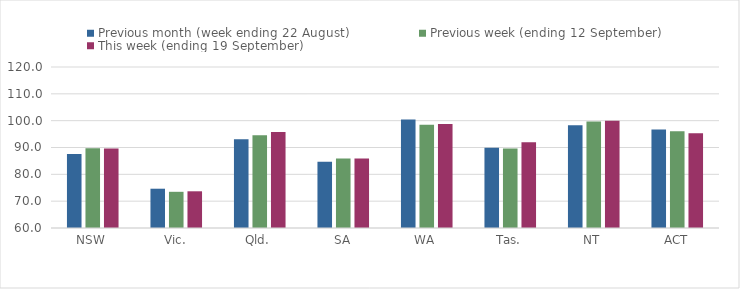
| Category | Previous month (week ending 22 August) | Previous week (ending 12 September) | This week (ending 19 September) |
|---|---|---|---|
| NSW | 87.59 | 89.76 | 89.65 |
| Vic. | 74.64 | 73.49 | 73.68 |
| Qld. | 93.06 | 94.57 | 95.78 |
| SA | 84.72 | 85.94 | 85.87 |
| WA | 100.45 | 98.51 | 98.73 |
| Tas. | 89.95 | 89.67 | 91.92 |
| NT | 98.3 | 99.72 | 99.97 |
| ACT | 96.71 | 96.04 | 95.35 |